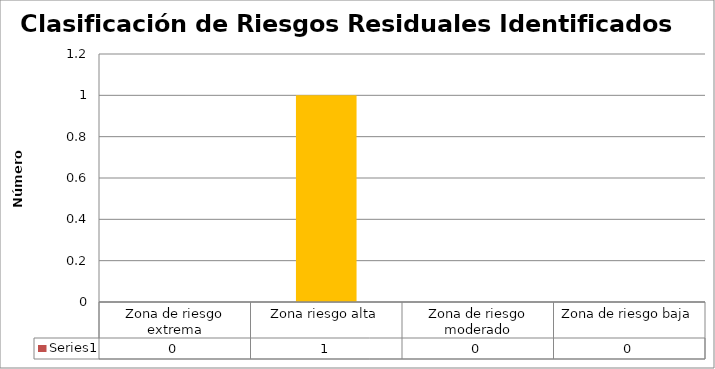
| Category | Series 0 |
|---|---|
| Zona de riesgo extrema | 0 |
| Zona riesgo alta | 1 |
| Zona de riesgo moderado | 0 |
| Zona de riesgo baja | 0 |